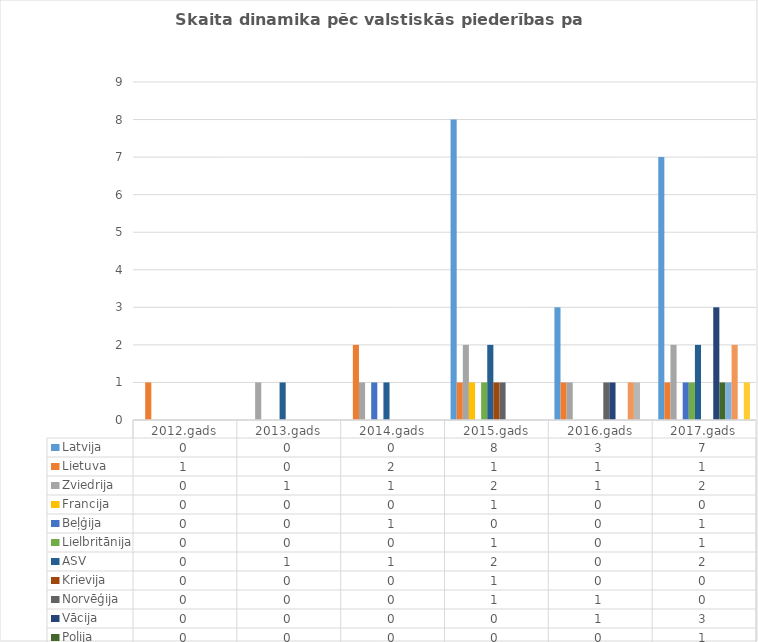
| Category | Latvija | Lietuva | Zviedrija | Francija | Beļģija | Lielbritānija | ASV | Krievija | Norvēģija | Vācija | Polija | Dānija | Austrija | Somija | Izraēla |
|---|---|---|---|---|---|---|---|---|---|---|---|---|---|---|---|
| 2012.gads | 0 | 1 | 0 | 0 | 0 | 0 | 0 | 0 | 0 | 0 | 0 | 0 | 0 | 0 | 0 |
| 2013.gads | 0 | 0 | 1 | 0 | 0 | 0 | 1 | 0 | 0 | 0 | 0 | 0 | 0 | 0 | 0 |
| 2014.gads | 0 | 2 | 1 | 0 | 1 | 0 | 1 | 0 | 0 | 0 | 0 | 0 | 0 | 0 | 0 |
| 2015.gads | 8 | 1 | 2 | 1 | 0 | 1 | 2 | 1 | 1 | 0 | 0 | 0 | 0 | 0 | 0 |
| 2016.gads | 3 | 1 | 1 | 0 | 0 | 0 | 0 | 0 | 1 | 1 | 0 | 0 | 1 | 1 | 0 |
| 2017.gads | 7 | 1 | 2 | 0 | 1 | 1 | 2 | 0 | 0 | 3 | 1 | 1 | 2 | 0 | 1 |